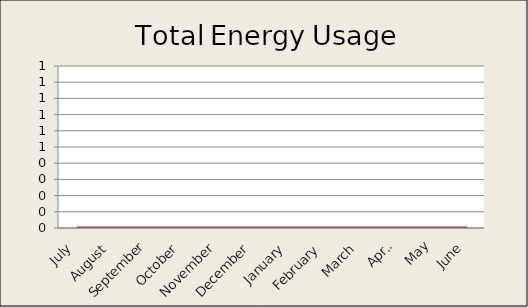
| Category | Total Energy Usage (kBTU) |
|---|---|
| 0 | 0 |
| 1 | 0 |
| 2 | 0 |
| 3 | 0 |
| 4 | 0 |
| 5 | 0 |
| 6 | 0 |
| 7 | 0 |
| 8 | 0 |
| 9 | 0 |
| 10 | 0 |
| 11 | 0 |